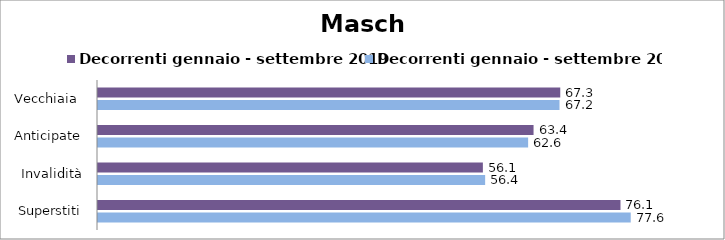
| Category | Decorrenti gennaio - settembre 2019 | Decorrenti gennaio - settembre 2020 |
|---|---|---|
| Vecchiaia  | 67.32 | 67.21 |
|  Anticipate | 63.43 | 62.64 |
| Invalidità | 56.05 | 56.38 |
| Superstiti | 76.09 | 77.58 |